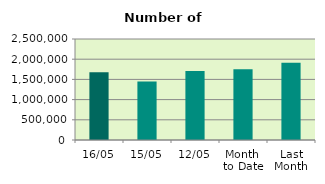
| Category | Series 0 |
|---|---|
| 16/05 | 1678940 |
| 15/05 | 1447878 |
| 12/05 | 1709600 |
| Month 
to Date | 1752096.364 |
| Last
Month | 1909115.889 |